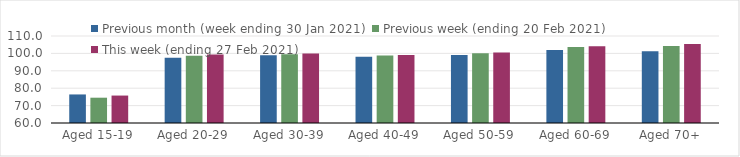
| Category | Previous month (week ending 30 Jan 2021) | Previous week (ending 20 Feb 2021) | This week (ending 27 Feb 2021) |
|---|---|---|---|
| Aged 15-19 | 76.41 | 74.54 | 75.77 |
| Aged 20-29 | 97.46 | 98.68 | 99.37 |
| Aged 30-39 | 98.88 | 99.47 | 99.99 |
| Aged 40-49 | 98.14 | 98.73 | 99.05 |
| Aged 50-59 | 99.15 | 100.08 | 100.57 |
| Aged 60-69 | 101.95 | 103.74 | 104.09 |
| Aged 70+ | 101.28 | 104.28 | 105.38 |